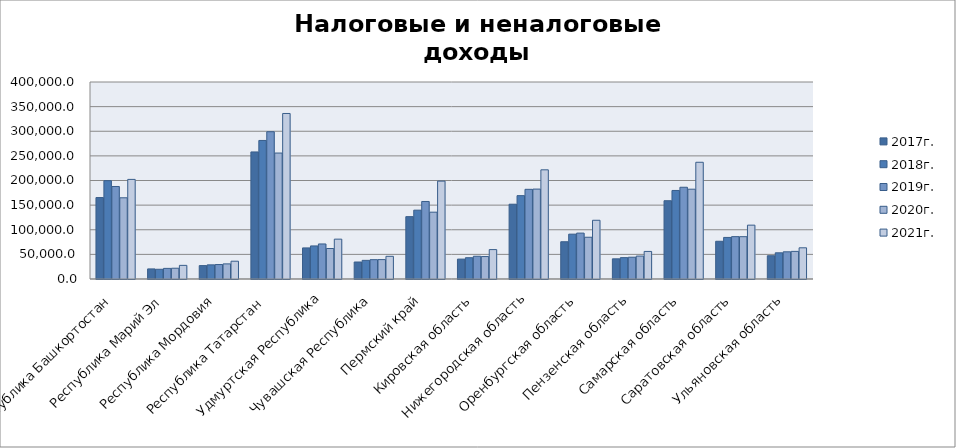
| Category | 2016г. | 2017г. | 2018г. | 2019г. | 2020г. | 2021г. |
|---|---|---|---|---|---|---|
| Республика Башкортостан |  | 165357.097 | 199632.703 | 187833.319 | 164887.688 | 202225.103 |
| Республика Марий Эл |  | 20468.649 | 19758.423 | 21553.299 | 21875.294 | 27676.036 |
| Республика Мордовия |  | 27216.182 | 28742.797 | 29377.43 | 30680.291 | 36122.888 |
| Республика Татарстан  |  | 258016.278 | 281304.394 | 299032.506 | 255771.242 | 336089.375 |
| Удмуртская Республика |  | 63123.507 | 67136.549 | 71138.923 | 61908.112 | 80909.53 |
| Чувашская Республика |  | 34500.189 | 37876.871 | 39217.309 | 39398.675 | 46050.001 |
| Пермский край |  | 126604.108 | 139755.376 | 157402.011 | 135683.644 | 198751.374 |
| Кировская область |  | 40402.299 | 43223.877 | 46174.574 | 45588.856 | 59690.427 |
| Нижегородская область |  | 151844.954 | 169253.479 | 182095.759 | 182579.174 | 221686.057 |
| Оренбургская область |  | 75642.138 | 91075.441 | 93195.976 | 84802.096 | 119234.036 |
| Пензенская область |  | 40963.165 | 43376.927 | 44250.559 | 46573.583 | 55971.236 |
| Самарская область |  | 158946.403 | 179766.601 | 186281.114 | 182338.76 | 237012.348 |
| Саратовская область |  | 76609.148 | 84413.477 | 86039.678 | 85924.763 | 109352.494 |
| Ульяновская область |  | 47244.369 | 53177.441 | 55214.012 | 56087.528 | 63351.155 |